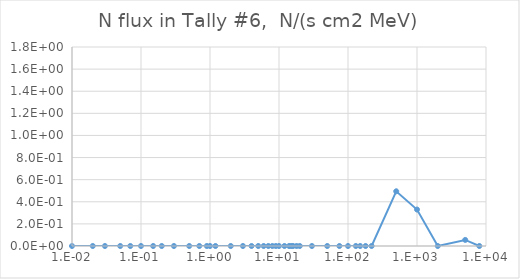
| Category | Series 0 |
|---|---|
| 1e-09 | 0 |
| 1e-08 | 0 |
| 2.5e-08 | 0 |
| 1e-07 | 0 |
| 2e-07 | 0 |
| 5e-07 | 0 |
| 1e-06 | 0 |
| 2e-06 | 0 |
| 5e-06 | 0 |
| 1e-05 | 0 |
| 2e-05 | 0 |
| 5e-05 | 0 |
| 0.0001 | 0 |
| 0.0002 | 0 |
| 0.0005 | 0 |
| 0.001 | 0 |
| 0.002 | 0 |
| 0.005 | 0 |
| 0.01 | 0 |
| 0.02 | 0 |
| 0.03 | 0 |
| 0.05 | 0 |
| 0.07 | 0 |
| 0.1 | 0 |
| 0.15 | 0 |
| 0.2 | 5817.637 |
| 0.3 | 0 |
| 0.5 | 0 |
| 0.7 | 0 |
| 0.9 | 1457.753 |
| 1.0 | 0 |
| 1.2 | 0 |
| 2.0 | 0 |
| 3.0 | 0 |
| 4.0 | 0 |
| 5.0 | 29.221 |
| 6.0 | 0 |
| 7.0 | 0 |
| 8.0 | 0 |
| 9.0 | 0 |
| 10.0 | 0 |
| 12.0 | 0 |
| 14.0 | 0 |
| 15.0 | 0 |
| 16.0 | 0 |
| 18.0 | 0 |
| 20.0 | 0 |
| 30.0 | 0 |
| 50.0 | 1.461 |
| 75.0 | 0 |
| 100.0 | 1.169 |
| 130.0 | 2.922 |
| 150.0 | 4.383 |
| 180.0 | 11.688 |
| 220.0 | 17.054 |
| 500.0 | 4.004 |
| 1000.0 | 0.701 |
| 2000.0 | 0.175 |
| 5000.0 | 0.029 |
| 8000.0 | 0.019 |